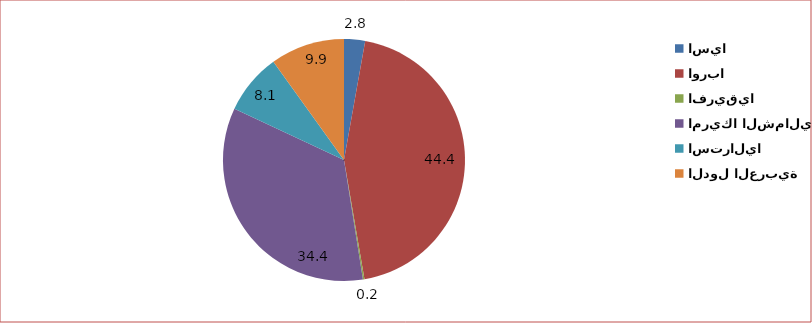
| Category | Series 0 |
|---|---|
| اسيا | 2.8 |
| اوربا  | 44.4 |
| افريقيا | 0.2 |
| امريكا الشمالية  | 34.4 |
| استراليا | 8.1 |
| الدول العربية  | 9.9 |